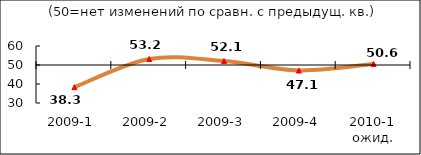
| Category | Диф.индекс ↓ |
|---|---|
| 2009-1 | 38.315 |
| 2009-2 | 53.16 |
| 2009-3 | 52.08 |
| 2009-4 | 47.12 |
| 2010-1 ожид. | 50.575 |